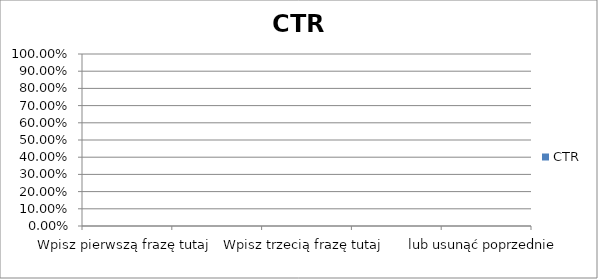
| Category | CTR |
|---|---|
| Wpisz pierwszą frazę tutaj | 0 |
| Wpisz drugą frazę tutaj | 0 |
| Wpisz trzecią frazę tutaj | 0 |
| Możesz dodać kolejne wiersze | 0 |
| lub usunąć poprzednie | 0 |